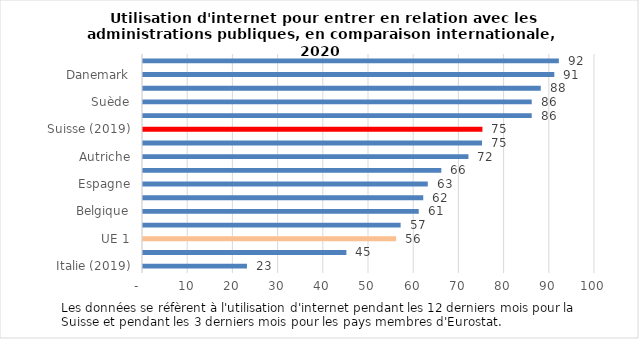
| Category | Series 0 |
|---|---|
| Italie (2019) | 23 |
| Portugal | 45 |
| UE 1 | 56 |
| Royaume-Uni | 57 |
| Belgique | 61 |
| Irlande | 62 |
| Espagne | 63 |
| Allemagne | 66 |
| Autriche | 72 |
| France (2019) | 75 |
| Suisse (2019) | 75.093 |
| Pays-Bas | 86 |
| Suède | 86 |
| Finlande | 88 |
| Danemark | 91 |
| Norvège | 92 |